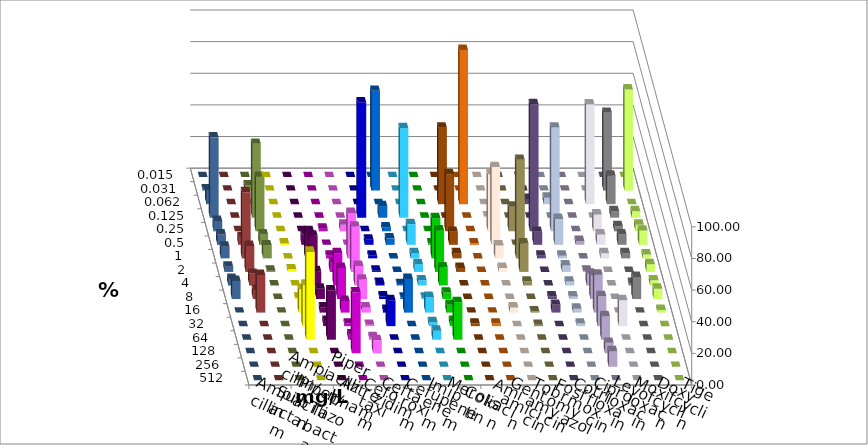
| Category | Ampicillin | Ampicillin/ Sulbactam | Piperacillin | Piperacillin/ Tazobactam | Aztreonam | Cefotaxim | Ceftazidim | Cefuroxim | Imipenem | Meropenem | Colistin | Amikacin | Gentamicin | Tobramycin | Fosfomycin | Cotrimoxazol | Ciprofloxacin | Levofloxacin | Moxifloxacin | Doxycyclin | Tigecyclin |
|---|---|---|---|---|---|---|---|---|---|---|---|---|---|---|---|---|---|---|---|---|---|
| 0.015 | 0 | 0 | 0 | 0 | 0 | 0 | 0 | 0 | 0 | 0 | 0 | 0 | 0 | 0 | 0 | 0 | 0 | 0 | 0 | 0 | 0 |
| 0.031 | 0 | 0 | 0 | 0 | 0 | 63.115 | 0 | 0 | 0 | 0 | 0 | 0 | 0 | 0 | 0 | 0 | 49.18 | 63.934 | 0.82 | 0 | 3.279 |
| 0.062 | 0 | 0 | 0 | 0 | 0 | 0 | 0 | 0 | 48.361 | 97.541 | 0 | 0 | 3.279 | 4.098 | 0 | 63.115 | 18.033 | 0 | 9.016 | 0 | 0 |
| 0.125 | 0 | 0 | 0 | 0 | 72.951 | 7.377 | 56.557 | 0 | 0 | 0 | 0.82 | 0 | 0 | 0 | 0 | 0 | 4.098 | 4.098 | 50.82 | 0 | 46.721 |
| 0.25 | 0 | 0 | 1.639 | 4.098 | 0 | 2.459 | 0 | 0 | 36.066 | 0 | 36.066 | 15.574 | 80.328 | 65.574 | 0 | 10.656 | 3.279 | 4.098 | 6.557 | 0 | 34.426 |
| 0.5 | 0.82 | 6.557 | 0 | 0 | 3.279 | 4.098 | 13.115 | 0.82 | 8.197 | 0.82 | 49.18 | 0 | 8.197 | 16.393 | 2.479 | 6.557 | 6.557 | 9.016 | 6.557 | 4.918 | 6.557 |
| 1.0 | 0 | 17.213 | 1.639 | 28.689 | 1.639 | 0 | 3.279 | 25.41 | 3.279 | 0 | 8.197 | 62.295 | 1.639 | 1.639 | 0 | 3.279 | 3.279 | 2.459 | 7.377 | 41.803 | 8.197 |
| 2.0 | 1.639 | 22.951 | 5.738 | 28.689 | 0.82 | 0 | 4.918 | 26.23 | 2.459 | 0 | 2.459 | 18.033 | 0 | 4.098 | 0.826 | 0 | 0 | 4.918 | 3.279 | 16.393 | 0.82 |
| 4.0 | 0 | 9.016 | 20.492 | 12.295 | 1.639 | 0.82 | 3.279 | 11.475 | 0 | 0 | 0 | 2.459 | 0 | 2.459 | 7.438 | 0 | 1.639 | 3.279 | 4.098 | 7.377 | 0 |
| 8.0 | 0.82 | 6.557 | 19.672 | 12.295 | 1.639 | 0.82 | 0.82 | 4.098 | 0 | 0 | 0 | 0 | 1.639 | 1.639 | 14.876 | 0 | 13.934 | 6.557 | 11.475 | 5.738 | 0 |
| 16.0 | 14.754 | 3.279 | 7.377 | 3.279 | 1.639 | 21.311 | 9.836 | 4.918 | 0 | 0 | 3.279 | 0.82 | 4.918 | 2.459 | 23.967 | 0 | 0 | 1.639 | 0 | 23.77 | 0 |
| 32.0 | 26.23 | 3.279 | 1.639 | 0.82 | 16.393 | 0 | 2.459 | 3.279 | 1.639 | 1.639 | 0 | 0.82 | 0 | 1.639 | 19.008 | 16.393 | 0 | 0 | 0 | 0 | 0 |
| 64.0 | 55.738 | 31.148 | 3.279 | 1.639 | 0 | 0 | 5.738 | 23.77 | 0 | 0 | 0 | 0 | 0 | 0 | 14.876 | 0 | 0 | 0 | 0 | 0 | 0 |
| 128.0 | 0 | 0 | 38.525 | 8.197 | 0 | 0 | 0 | 0 | 0 | 0 | 0 | 0 | 0 | 0 | 6.612 | 0 | 0 | 0 | 0 | 0 | 0 |
| 256.0 | 0 | 0 | 0 | 0 | 0 | 0 | 0 | 0 | 0 | 0 | 0 | 0 | 0 | 0 | 9.917 | 0 | 0 | 0 | 0 | 0 | 0 |
| 512.0 | 0 | 0 | 0 | 0 | 0 | 0 | 0 | 0 | 0 | 0 | 0 | 0 | 0 | 0 | 0 | 0 | 0 | 0 | 0 | 0 | 0 |